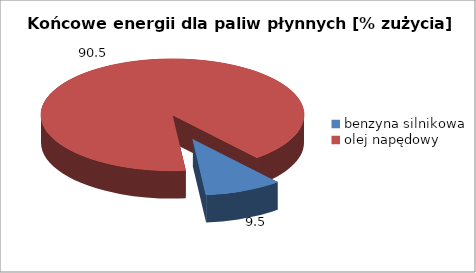
| Category | benzyna silnikowa olej napędowy |
|---|---|
| benzyna silnikowa | 9.514 |
| olej napędowy | 90.486 |